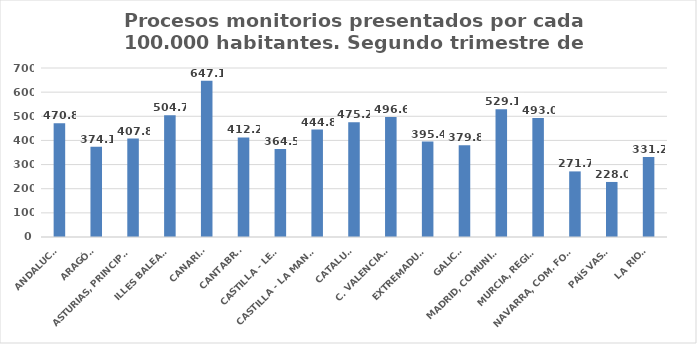
| Category | Series 0 |
|---|---|
| ANDALUCÍA | 470.81 |
| ARAGÓN | 374.092 |
| ASTURIAS, PRINCIPADO | 407.765 |
| ILLES BALEARS | 504.653 |
| CANARIAS | 647.074 |
| CANTABRIA | 412.151 |
| CASTILLA - LEÓN | 364.463 |
| CASTILLA - LA MANCHA | 444.841 |
| CATALUÑA | 475.158 |
| C. VALENCIANA | 496.559 |
| EXTREMADURA | 395.354 |
| GALICIA | 379.785 |
| MADRID, COMUNIDAD | 529.057 |
| MURCIA, REGIÓN | 493 |
| NAVARRA, COM. FORAL | 271.695 |
| PAÍS VASCO | 227.981 |
| LA RIOJA | 331.158 |